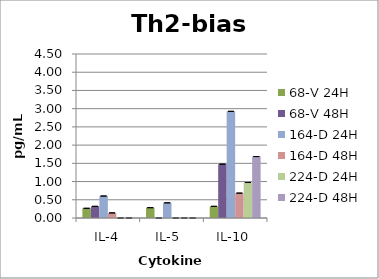
| Category | 68-A 24H | 68-A 48H | 68-V 24H | 68-V 48H | 139-A 24H | 139-A 48H | 164-D 24H | 164-D 48H | 224-D 24H | 224-D 48H |
|---|---|---|---|---|---|---|---|---|---|---|
| IL-4 |  |  | 0.267 | 0.32 |  |  | 0.603 | 0.14 | 0 | 0 |
| IL-5  |  |  | 0.283 | 0 |  |  | 0.417 | 0 | 0 | 0 |
| IL-10 |  |  | 0.32 | 1.477 |  |  | 2.927 | 0.683 | 0.973 | 1.686 |